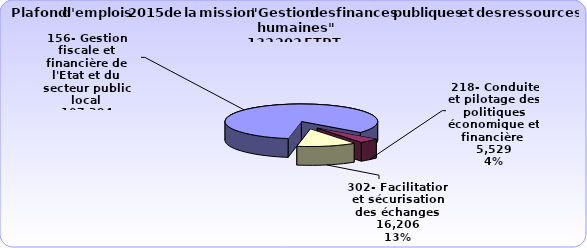
| Category | Series 0 |
|---|---|
| 156- Gestion fiscale et financière de l'Etat et du secteur public local | 107294 |
| 218- Conduite et pilotage des politiques économique et financière  | 5529 |
| 302- Facilitation et sécurisation des échanges | 16206 |